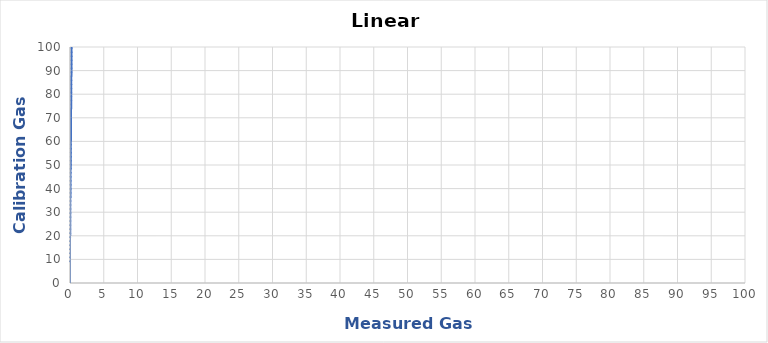
| Category | Series 0 |
|---|---|
| 0.0 | 0 |
| 0.005131266842311731 | 10 |
| 0.019489142375178976 | 20 |
| 0.041339215146898665 | 30 |
| 0.06632009248190279 | 40 |
| 0.09926295869590594 | 50 |
| 0.12907691774048188 | 60 |
| 0.1563192817121982 | 70 |
| 0.18633622150674042 | 80 |
| 0.2095398714741094 | 90 |
| 0.23056330850664644 | 100 |